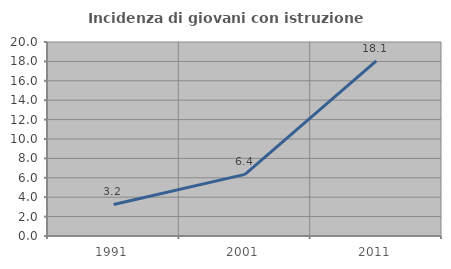
| Category | Incidenza di giovani con istruzione universitaria |
|---|---|
| 1991.0 | 3.249 |
| 2001.0 | 6.355 |
| 2011.0 | 18.06 |